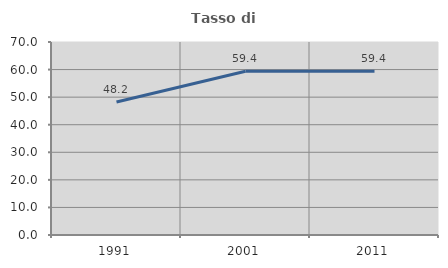
| Category | Tasso di occupazione   |
|---|---|
| 1991.0 | 48.212 |
| 2001.0 | 59.409 |
| 2011.0 | 59.368 |